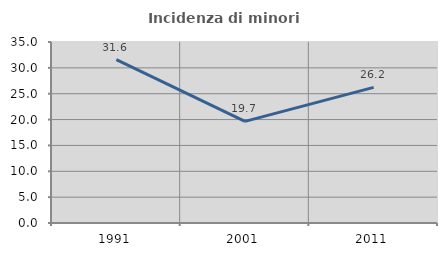
| Category | Incidenza di minori stranieri |
|---|---|
| 1991.0 | 31.579 |
| 2001.0 | 19.658 |
| 2011.0 | 26.232 |